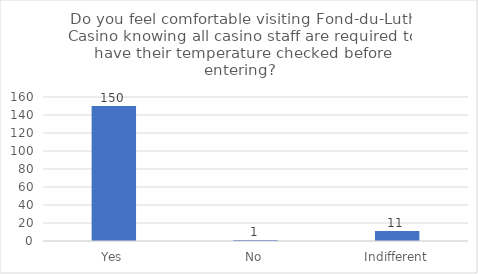
| Category | Series 0 |
|---|---|
| Yes | 150 |
| No | 1 |
| Indifferent | 11 |